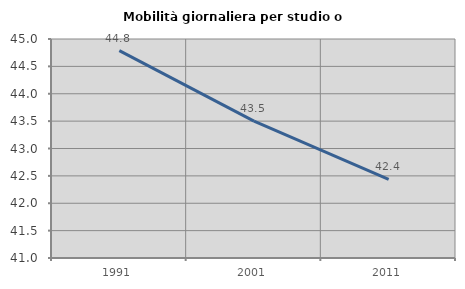
| Category | Mobilità giornaliera per studio o lavoro |
|---|---|
| 1991.0 | 44.788 |
| 2001.0 | 43.499 |
| 2011.0 | 42.436 |